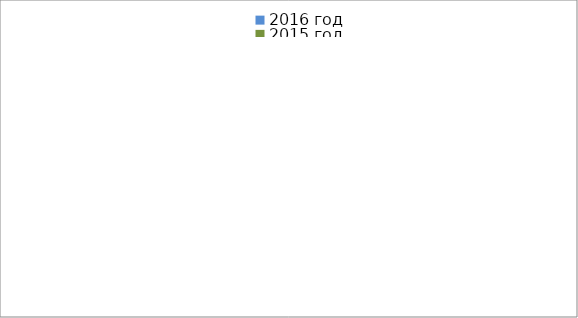
| Category | 2016 год | 2015 год |
|---|---|---|
|  - поджог | 19 | 6 |
|  - неосторожное обращение с огнём | 16 | 23 |
|  - НПТЭ электрооборудования | 3 | 4 |
|  - НПУ и Э печей | 21 | 20 |
|  - НПУ и Э транспортных средств | 9 | 27 |
|   -Шалость с огнем детей | 3 | 1 |
|  -НППБ при эксплуатации эл.приборов | 4 | 9 |
|  - курение | 3 | 8 |
| - прочие | 37 | 38 |
| - не установленные причины | 11 | 3 |